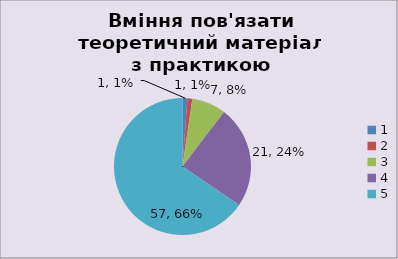
| Category | Кількість | % |
|---|---|---|
| 0 | 1 | 0.011 |
| 1 | 1 | 0.011 |
| 2 | 7 | 0.08 |
| 3 | 21 | 0.241 |
| 4 | 57 | 0.655 |